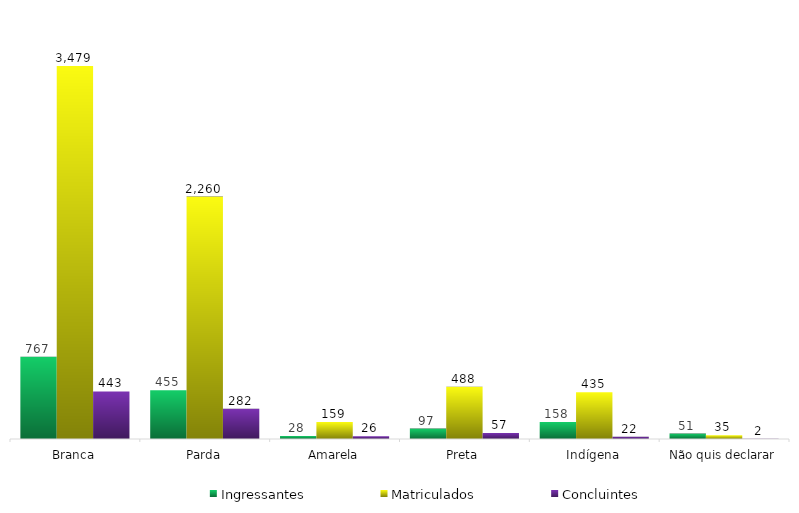
| Category | Ingressantes | Matriculados | Concluintes |
|---|---|---|---|
| Branca | 767 | 3479 | 443 |
| Parda | 455 | 2260 | 282 |
| Amarela | 28 | 159 | 26 |
| Preta | 97 | 488 | 57 |
| Indígena | 158 | 435 | 22 |
| Não quis declarar | 51 | 35 | 2 |